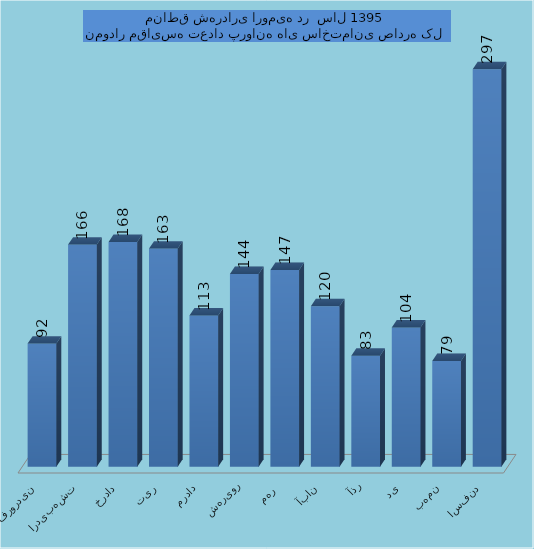
| Category | Series 0 |
|---|---|
| فروردین | 92 |
| اردیبهشت | 166 |
| خرداد | 168 |
| تیر | 163 |
| مرداد | 113 |
| شهریور | 144 |
| مهر  | 147 |
| آبان | 120 |
| آذر | 83 |
| دی | 104 |
| بهمن | 79 |
| اسفند | 297 |